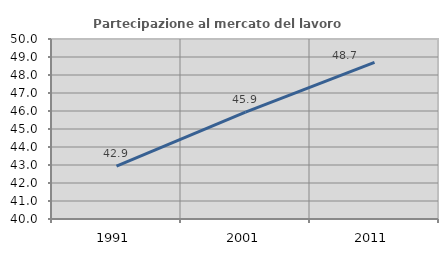
| Category | Partecipazione al mercato del lavoro  femminile |
|---|---|
| 1991.0 | 42.938 |
| 2001.0 | 45.934 |
| 2011.0 | 48.704 |